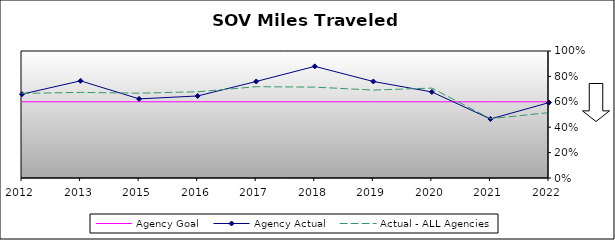
| Category | Agency Goal | Agency Actual | Actual - ALL Agencies |
|---|---|---|---|
| 2012.0 | 0.6 | 0.66 | 0.666 |
| 2013.0 | 0.6 | 0.765 | 0.674 |
| 2015.0 | 0.6 | 0.623 | 0.668 |
| 2016.0 | 0.6 | 0.646 | 0.679 |
| 2017.0 | 0.6 | 0.76 | 0.719 |
| 2018.0 | 0.6 | 0.879 | 0.715 |
| 2019.0 | 0.6 | 0.76 | 0.692 |
| 2020.0 | 0.6 | 0.678 | 0.708 |
| 2021.0 | 0.6 | 0.465 | 0.467 |
| 2022.0 | 0.6 | 0.594 | 0.515 |